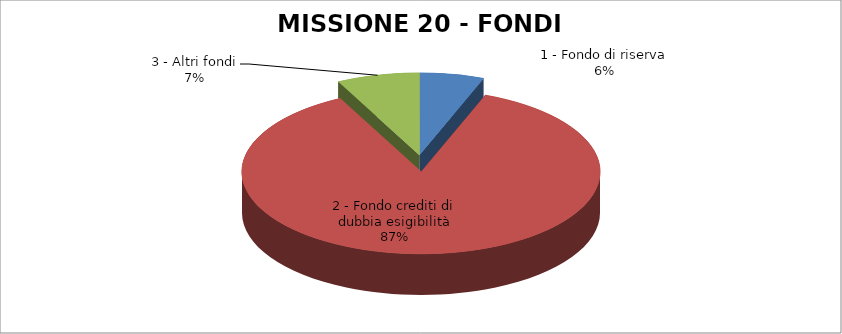
| Category | Series 0 |
|---|---|
| 1 - Fondo di riserva | 139432.89 |
| 2 - Fondo crediti di dubbia esigibilità | 2074415.11 |
| 3 - Altri fondi | 178770 |